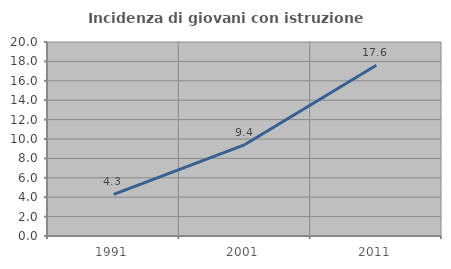
| Category | Incidenza di giovani con istruzione universitaria |
|---|---|
| 1991.0 | 4.288 |
| 2001.0 | 9.428 |
| 2011.0 | 17.597 |